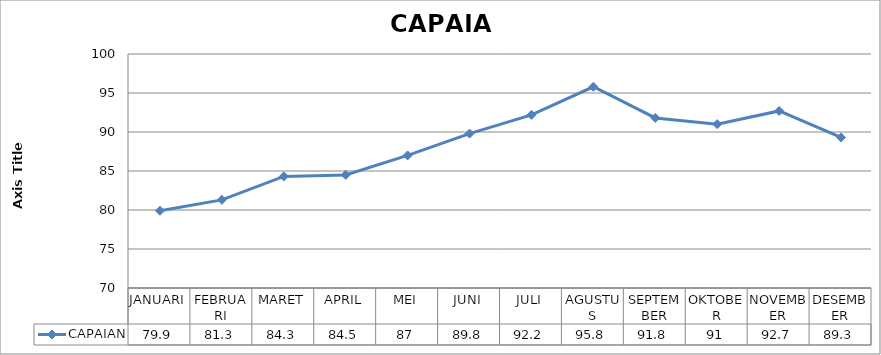
| Category | CAPAIAN |
|---|---|
| JANUARI | 79.9 |
| FEBRUARI | 81.3 |
| MARET | 84.3 |
| APRIL | 84.5 |
| MEI | 87 |
| JUNI | 89.8 |
| JULI | 92.2 |
| AGUSTUS | 95.8 |
| SEPTEMBER | 91.8 |
| OKTOBER | 91 |
| NOVEMBER | 92.7 |
| DESEMBER | 89.3 |